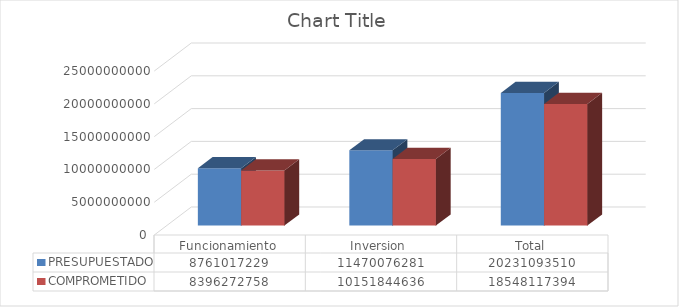
| Category | PRESUPUESTADO | COMPROMETIDO |
|---|---|---|
| Funcionamiento | 8761017229 | 8396272758 |
| Inversion  | 11470076281 | 10151844635.58 |
| Total | 20231093510 | 18548117393.58 |